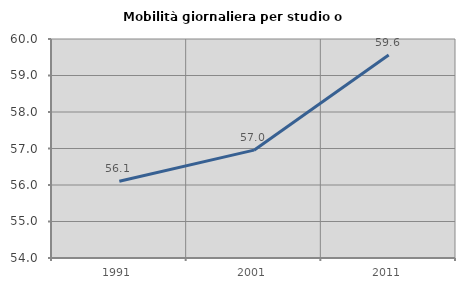
| Category | Mobilità giornaliera per studio o lavoro |
|---|---|
| 1991.0 | 56.102 |
| 2001.0 | 56.955 |
| 2011.0 | 59.561 |